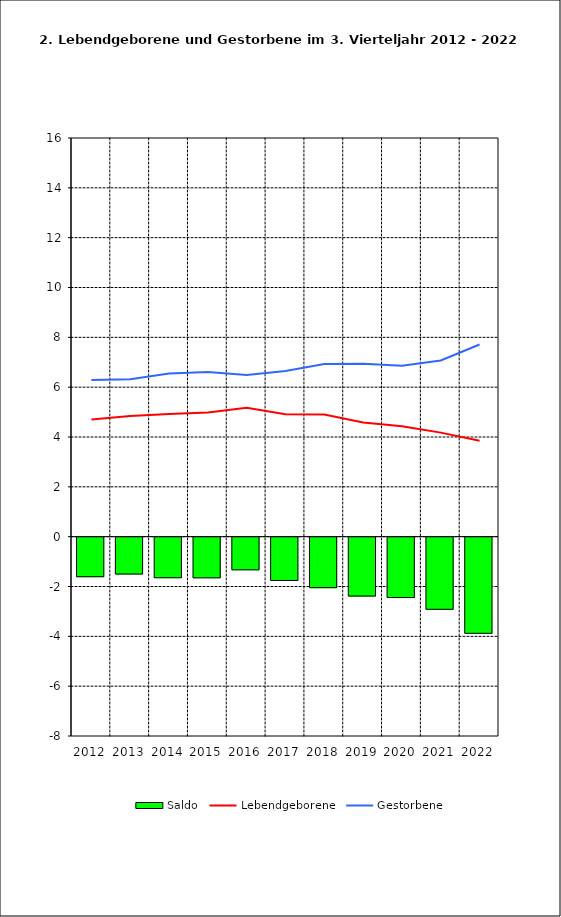
| Category | Saldo |
|---|---|
| 2011.0 | -1.587 |
| 2012.0 | -1.48 |
| 2013.0 | -1.627 |
| 2014.0 | -1.632 |
| 2015.0 | -1.311 |
| 2016.0 | -1.739 |
| 2017.0 | -2.026 |
| 2018.0 | -2.364 |
| 2019.0 | -2.424 |
| 2020.0 | -2.895 |
| 2021.0 | -3.859 |